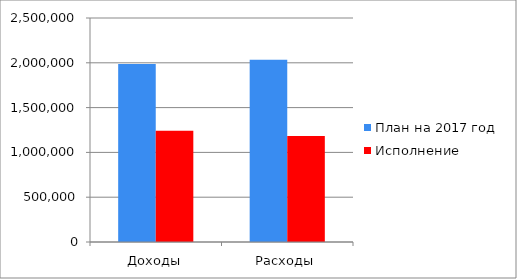
| Category | План на 2017 год | Исполнение |
|---|---|---|
| Доходы | 1986239 | 1242990 |
| Расходы | 2032798 | 1183803 |